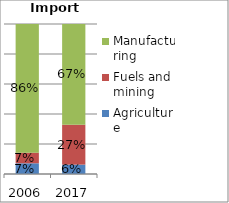
| Category | Agriculture | Fuels and mining | Manufacturing |
|---|---|---|---|
| 2006.0 | 0.071 | 0.071 | 0.858 |
| 2017.0 | 0.062 | 0.266 | 0.672 |